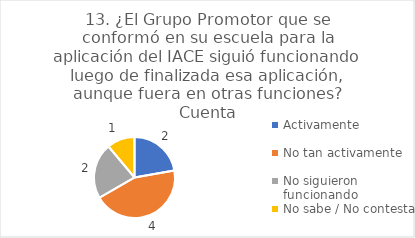
| Category | 13. ¿El Grupo Promotor que se conformó en su escuela para la aplicación del IACE siguió funcionando luego de finalizada esa aplicación, aunque fuera en otras funciones? |
|---|---|
| Activamente  | 0.222 |
| No tan activamente  | 0.444 |
| No siguieron funcionando  | 0.222 |
| No sabe / No contesta | 0.111 |